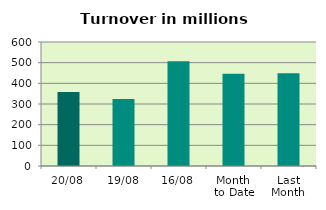
| Category | Series 0 |
|---|---|
| 20/08 | 358.37 |
| 19/08 | 323.71 |
| 16/08 | 506.473 |
| Month 
to Date | 446.286 |
| Last
Month | 448.907 |